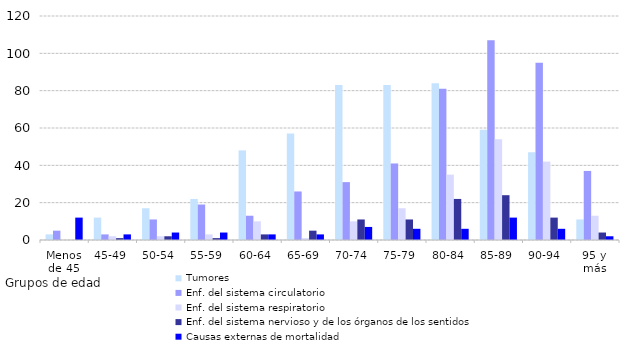
| Category | Tumores | Enf. del sistema circulatorio | Enf. del sistema respiratorio | Enf. del sistema nervioso y de los órganos de los sentidos | Causas externas de mortalidad |
|---|---|---|---|---|---|
| Menos de 45 | 3 | 5 | 0 | 0 | 12 |
| 45-49 | 12 | 3 | 2 | 1 | 3 |
| 50-54 | 17 | 11 | 2 | 2 | 4 |
| 55-59 | 22 | 19 | 3 | 1 | 4 |
| 60-64 | 48 | 13 | 10 | 3 | 3 |
| 65-69 | 57 | 26 | 1 | 5 | 3 |
| 70-74 | 83 | 31 | 10 | 11 | 7 |
| 75-79 | 83 | 41 | 17 | 11 | 6 |
| 80-84 | 84 | 81 | 35 | 22 | 6 |
| 85-89 | 59 | 107 | 54 | 24 | 12 |
| 90-94 | 47 | 95 | 42 | 12 | 6 |
| 95 y más | 11 | 37 | 13 | 4 | 2 |